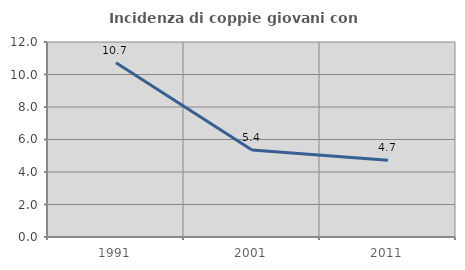
| Category | Incidenza di coppie giovani con figli |
|---|---|
| 1991.0 | 10.723 |
| 2001.0 | 5.355 |
| 2011.0 | 4.72 |